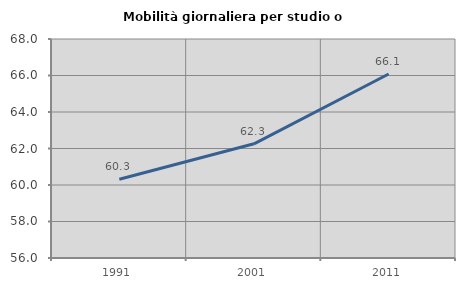
| Category | Mobilità giornaliera per studio o lavoro |
|---|---|
| 1991.0 | 60.317 |
| 2001.0 | 62.257 |
| 2011.0 | 66.08 |